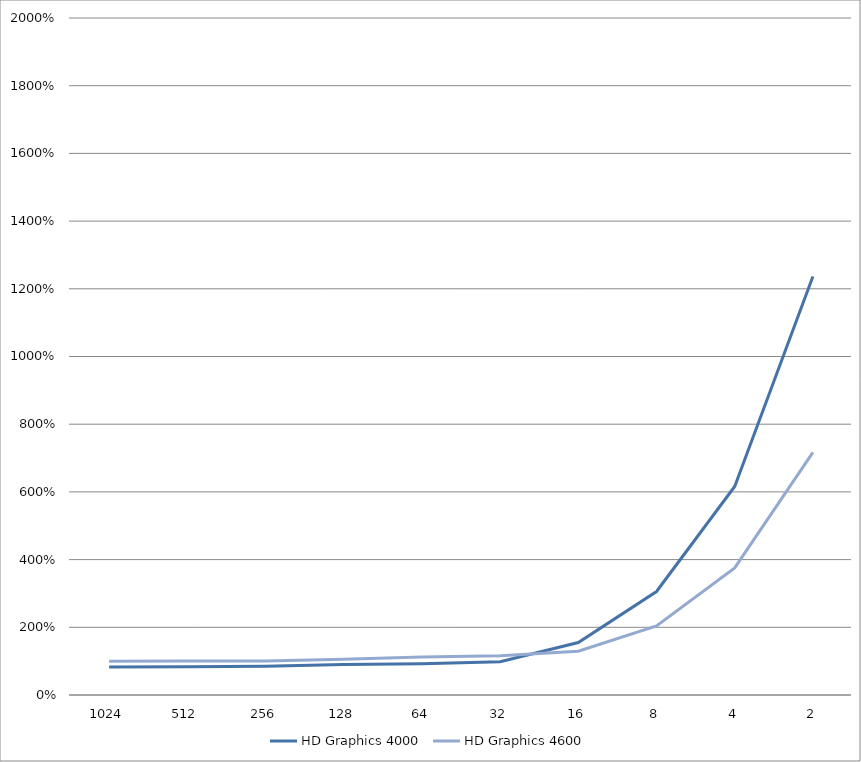
| Category | HD Graphics 4000 | HD Graphics 4600 |
|---|---|---|
| 1024.0 | 0.826 | 1 |
| 512.0 | 0.835 | 1.003 |
| 256.0 | 0.847 | 1.003 |
| 128.0 | 0.898 | 1.057 |
| 64.0 | 0.922 | 1.12 |
| 32.0 | 0.985 | 1.159 |
| 16.0 | 1.55 | 1.291 |
| 8.0 | 3.057 | 2.039 |
| 4.0 | 6.162 | 3.757 |
| 2.0 | 12.366 | 7.165 |